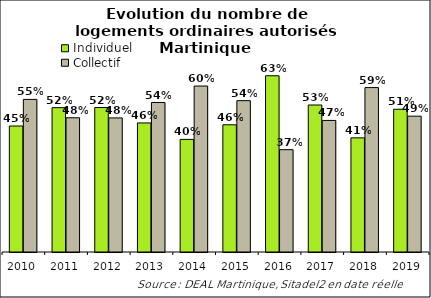
| Category | Individuel | Collectif |
|---|---|---|
| 2010.0 | 0.452 | 0.548 |
| 2011.0 | 0.518 | 0.482 |
| 2012.0 | 0.519 | 0.481 |
| 2013.0 | 0.463 | 0.537 |
| 2014.0 | 0.404 | 0.596 |
| 2015.0 | 0.457 | 0.543 |
| 2016.0 | 0.633 | 0.367 |
| 2017.0 | 0.528 | 0.472 |
| 2018.0 | 0.41 | 0.59 |
| 2019.0 | 0.512 | 0.488 |